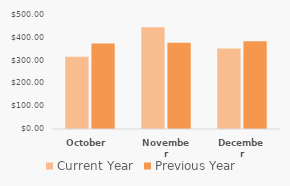
| Category | Current Year | Previous Year |
|---|---|---|
| October  | 316.57 | 374.6 |
| November | 446.643 | 378 |
| December | 353.119 | 385 |